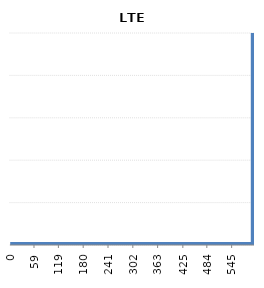
| Category | LTE |
|---|---|
| 0.0 | 0 |
| 573.0 | 0 |
| 573.0 | 0 |
| 599.0 | 0 |
| 599.0 | 1 |